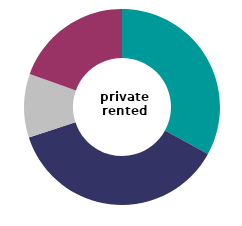
| Category | private 
rented |
|---|---|
| zero costs | 32.978 |
| £1-20/m² | 36.994 |
| £20-35/m² | 10.507 |
| £35/m² or over | 19.521 |